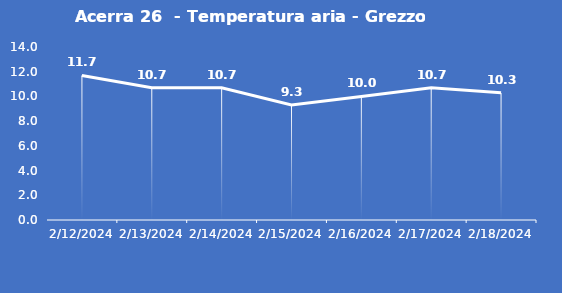
| Category | Acerra 26  - Temperatura aria - Grezzo (°C) |
|---|---|
| 2/12/24 | 11.7 |
| 2/13/24 | 10.7 |
| 2/14/24 | 10.7 |
| 2/15/24 | 9.3 |
| 2/16/24 | 10 |
| 2/17/24 | 10.7 |
| 2/18/24 | 10.3 |